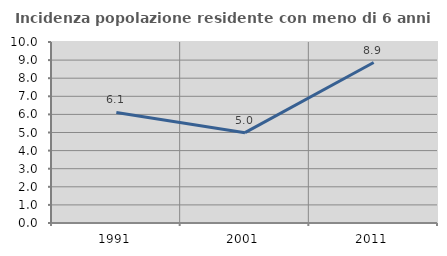
| Category | Incidenza popolazione residente con meno di 6 anni |
|---|---|
| 1991.0 | 6.105 |
| 2001.0 | 4.99 |
| 2011.0 | 8.865 |